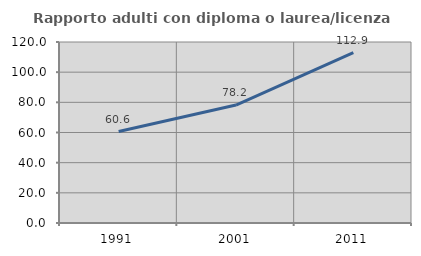
| Category | Rapporto adulti con diploma o laurea/licenza media  |
|---|---|
| 1991.0 | 60.646 |
| 2001.0 | 78.192 |
| 2011.0 | 112.889 |